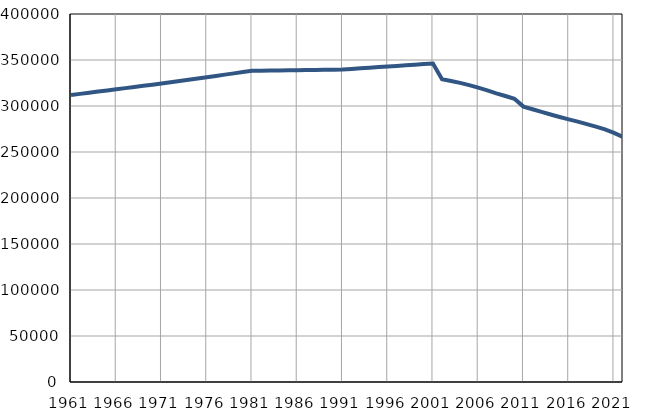
| Category | Број
становника |
|---|---|
| 1961.0 | 311916 |
| 1962.0 | 313167 |
| 1963.0 | 314418 |
| 1964.0 | 315669 |
| 1965.0 | 316920 |
| 1966.0 | 318172 |
| 1967.0 | 319423 |
| 1968.0 | 320674 |
| 1969.0 | 321925 |
| 1970.0 | 323176 |
| 1971.0 | 324427 |
| 1972.0 | 325809 |
| 1973.0 | 327191 |
| 1974.0 | 328573 |
| 1975.0 | 329955 |
| 1976.0 | 331337 |
| 1977.0 | 332719 |
| 1978.0 | 334101 |
| 1979.0 | 335483 |
| 1980.0 | 336865 |
| 1981.0 | 338247 |
| 1982.0 | 338387 |
| 1983.0 | 338526 |
| 1984.0 | 338666 |
| 1985.0 | 338806 |
| 1986.0 | 338946 |
| 1987.0 | 339085 |
| 1988.0 | 339225 |
| 1989.0 | 339365 |
| 1990.0 | 339504 |
| 1991.0 | 339644 |
| 1992.0 | 340303 |
| 1993.0 | 340962 |
| 1994.0 | 341621 |
| 1995.0 | 342280 |
| 1996.0 | 342940 |
| 1997.0 | 343599 |
| 1998.0 | 344258 |
| 1999.0 | 344917 |
| 2000.0 | 345576 |
| 2001.0 | 346235 |
| 2002.0 | 329116 |
| 2003.0 | 327161 |
| 2004.0 | 325118 |
| 2005.0 | 322703 |
| 2006.0 | 320029 |
| 2007.0 | 316999 |
| 2008.0 | 313798 |
| 2009.0 | 310839 |
| 2010.0 | 307904 |
| 2011.0 | 299345 |
| 2012.0 | 296456 |
| 2013.0 | 293598 |
| 2014.0 | 290747 |
| 2015.0 | 288034 |
| 2016.0 | 285509 |
| 2017.0 | 283007 |
| 2018.0 | 280290 |
| 2019.0 | 277560 |
| 2020.0 | 274549 |
| 2021.0 | 270844 |
| 2022.0 | 266384 |